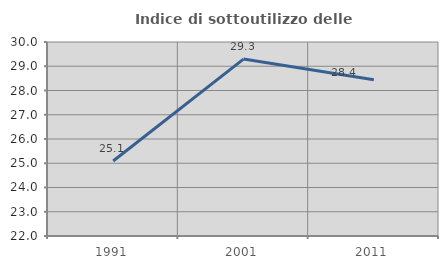
| Category | Indice di sottoutilizzo delle abitazioni  |
|---|---|
| 1991.0 | 25.091 |
| 2001.0 | 29.296 |
| 2011.0 | 28.441 |